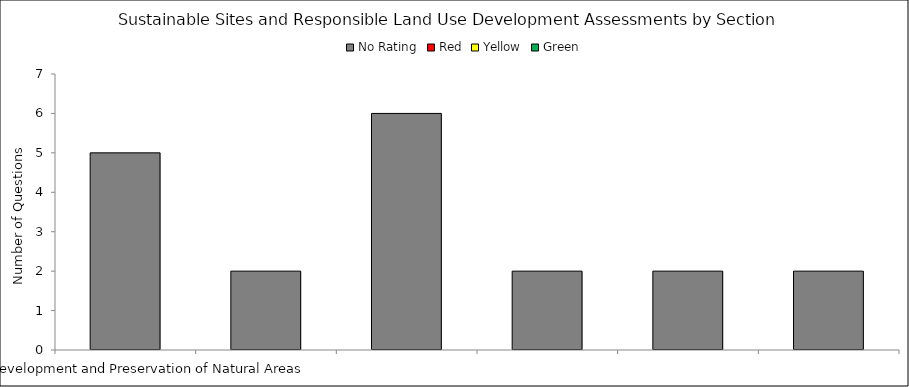
| Category | No Rating | Red | Yellow | Green |
|---|---|---|---|---|
| A.1 Site Development and Preservation of Natural Areas | 5 | 0 | 0 | 0 |
| A.2 Promote Infill and Redevelopment | 2 | 0 | 0 | 0 |
| A.3 Construction Phase Pollution Control | 6 | 0 | 0 | 0 |
| A.4 Post-Construction Stormwater Management | 2 | 0 | 0 | 0 |
| A.5 Heat Island Effect | 2 | 0 | 0 | 0 |
| A.6 Light Pollution Reduction | 2 | 0 | 0 | 0 |